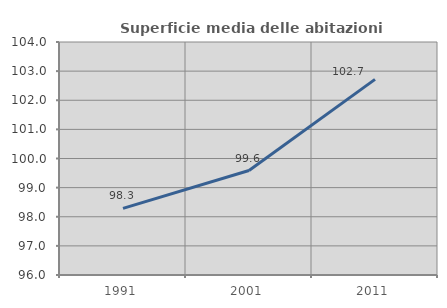
| Category | Superficie media delle abitazioni occupate |
|---|---|
| 1991.0 | 98.289 |
| 2001.0 | 99.586 |
| 2011.0 | 102.716 |